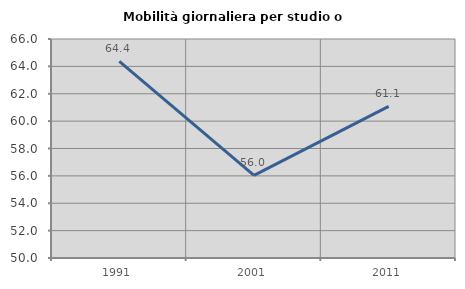
| Category | Mobilità giornaliera per studio o lavoro |
|---|---|
| 1991.0 | 64.365 |
| 2001.0 | 56.038 |
| 2011.0 | 61.073 |